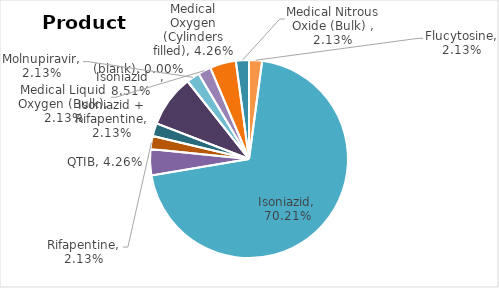
| Category | Total |
|---|---|
| Flucytosine | 0.021 |
| Isoniazid | 0.702 |
| QTIB | 0.043 |
| Rifapentine | 0.021 |
| Isoniazid + Rifapentine | 0.021 |
| Isoniazid    | 0.085 |
| (blank) | 0 |
| Molnupiravir | 0.021 |
| Medical Liquid Oxygen (Bulk) | 0.021 |
| Medical Oxygen (Cylinders filled) | 0.043 |
| Medical Nitrous Oxide (Bulk)  | 0.021 |